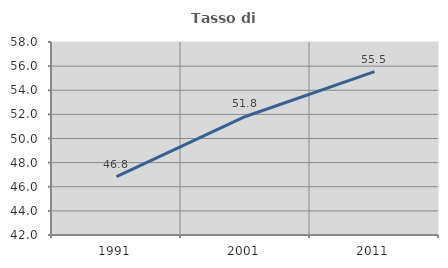
| Category | Tasso di occupazione   |
|---|---|
| 1991.0 | 46.833 |
| 2001.0 | 51.826 |
| 2011.0 | 55.546 |